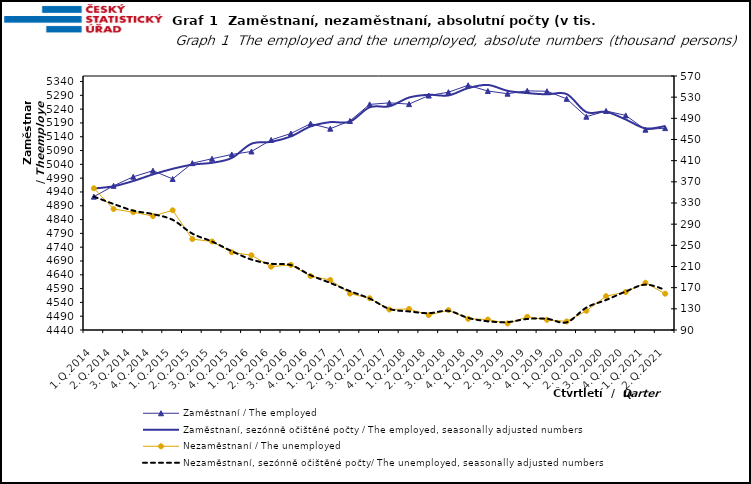
| Category | Zaměstnaní / The employed | Zaměstnaní, sezónně očištěné počty / The employed, seasonally adjusted numbers |
|---|---|---|
| 1.Q.2014 | 4922.963 | 4952.405 |
| 2.Q.2014 | 4962.219 | 4960.65 |
| 3.Q.2014 | 4994.947 | 4979.618 |
| 4.Q.2014 | 5017.051 | 5003.629 |
| 1.Q.2015 | 4987.141 | 5023.827 |
| 2.Q.2015 | 5044.285 | 5038.984 |
| 3.Q.2015 | 5060.3 | 5045.647 |
| 4.Q.2015 | 5075.884 | 5063.085 |
| 1.Q.2016 | 5086.671 | 5114.698 |
| 2.Q.2016 | 5128.493 | 5121.602 |
| 3.Q.2016 | 5151.712 | 5140.967 |
| 4.Q.2016 | 5187.436 | 5177.35 |
| 1.Q.2017 | 5169.203 | 5192.941 |
| 2.Q.2017 | 5197.265 | 5194.555 |
| 3.Q.2017 | 5257.26 | 5246.726 |
| 4.Q.2017 | 5262.691 | 5250.237 |
| 1.Q.2018 | 5258.225 | 5281.99 |
| 2.Q.2018 | 5289.242 | 5291.982 |
| 3.Q.2018 | 5301.361 | 5289.641 |
| 4.Q.2018 | 5326.327 | 5316.128 |
| 1.Q.2019 | 5305.534 | 5327.565 |
| 2.Q.2019 | 5295.929 | 5306.306 |
| 3.Q.2019 | 5306.247 | 5298.103 |
| 4.Q.2019 | 5304.7 | 5293.467 |
| 1.Q.2020 | 5277.418 | 5294.602 |
| 2.Q.2020 | 5212.593 | 5229.332 |
| 3.Q.2020 | 5233.335 | 5230.287 |
| 4.Q.2020 | 5217.23 | 5202.367 |
| 1.Q.2021 | 5165.582 | 5170.334 |
| 2.Q.2021 | 5171.252 | 5178.582 |